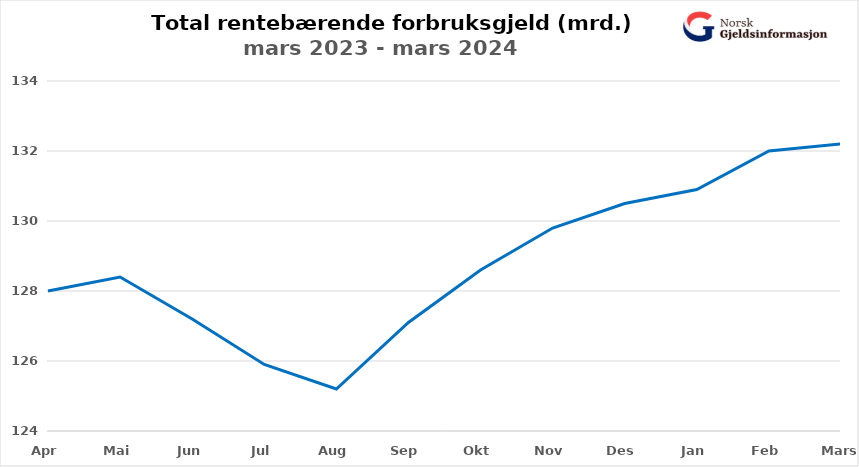
| Category | Rentebærende forbruksgjeld |
|---|---|
| Apr | 128 |
| Mai | 128.4 |
| Jun | 127.2 |
| Jul | 125.9 |
| Aug | 125.2 |
| Sep | 127.1 |
| Okt | 128.6 |
| Nov | 129.8 |
| Des | 130.5 |
| Jan | 130.9 |
| Feb | 132 |
| Mars | 132.2 |